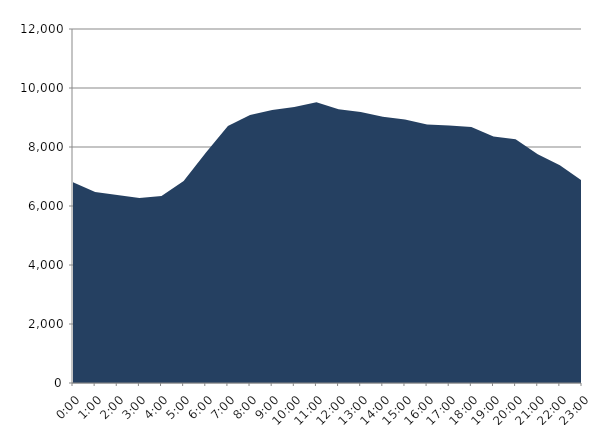
| Category | Series 0 | Series 1 |
|---|---|---|
| 2019-08-21 |  | 6805.74 |
| 2019-08-21 01:00:00 |  | 6476.5 |
| 2019-08-21 02:00:00 |  | 6376.1 |
| 2019-08-21 03:00:00 |  | 6271.68 |
| 2019-08-21 04:00:00 |  | 6337.43 |
| 2019-08-21 05:00:00 |  | 6850 |
| 2019-08-21 06:00:00 |  | 7804.5 |
| 2019-08-21 07:00:00 |  | 8715.89 |
| 2019-08-21 08:00:00 |  | 9083.57 |
| 2019-08-21 09:00:00 |  | 9253.48 |
| 2019-08-21 10:00:00 |  | 9358.3 |
| 2019-08-21 11:00:00 |  | 9519.29 |
| 2019-08-21 12:00:00 |  | 9279.16 |
| 2019-08-21 13:00:00 |  | 9187.6 |
| 2019-08-21 14:00:00 |  | 9024.37 |
| 2019-08-21 15:00:00 |  | 8929.18 |
| 2019-08-21 16:00:00 |  | 8764.5 |
| 2019-08-21 17:00:00 |  | 8731.14 |
| 2019-08-21 18:00:00 |  | 8679.73 |
| 2019-08-21 19:00:00 |  | 8352.32 |
| 2019-08-21 20:00:00 |  | 8265.04 |
| 2019-08-21 21:00:00 |  | 7753.61 |
| 2019-08-21 22:00:00 |  | 7377.36 |
| 2019-08-21 23:00:00 |  | 6861.43 |